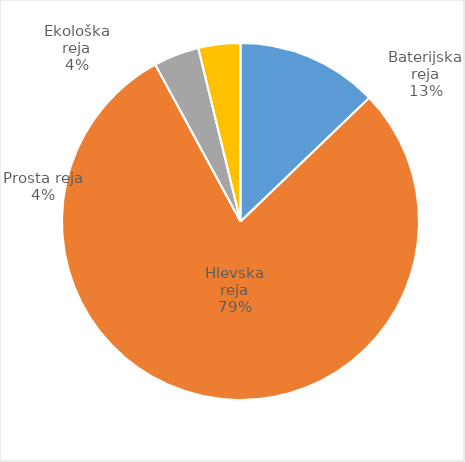
| Category | Število kosov jajc |
|---|---|
| Baterijska reja | 297102 |
| Hlevska reja | 1837450 |
| Prosta reja | 95393 |
| Ekološka reja | 88200 |